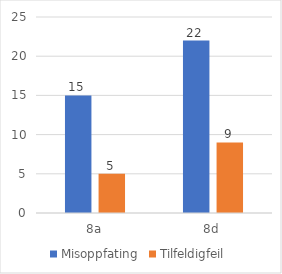
| Category | Misoppfating | Tilfeldigfeil |
|---|---|---|
| 8a | 15 | 5 |
| 8d | 22 | 9 |